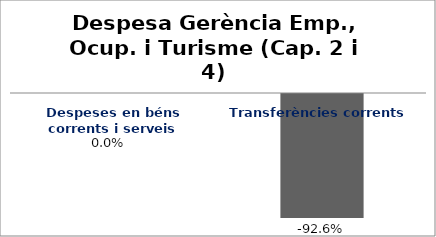
| Category | Series 0 |
|---|---|
| Despeses en béns corrents i serveis | 0 |
| Transferències corrents | -0.926 |